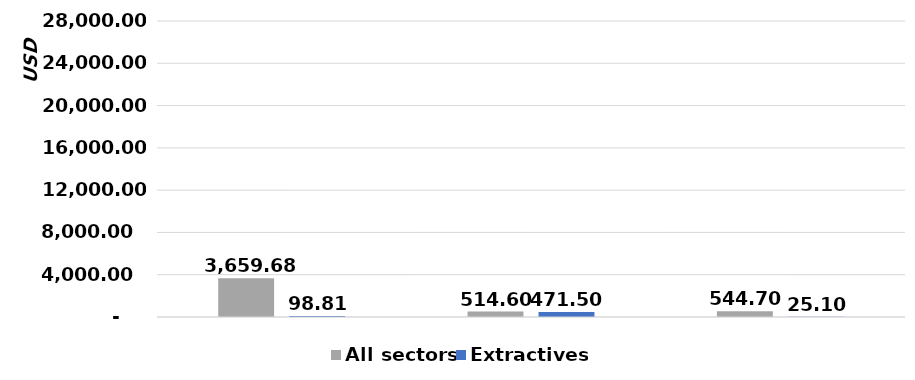
| Category | All sectors | Extractives |
|---|---|---|
|  | 3659677419 | 98811290 |
|  | 514600000 | 471500000 |
|  | 544700000 | 25100000 |